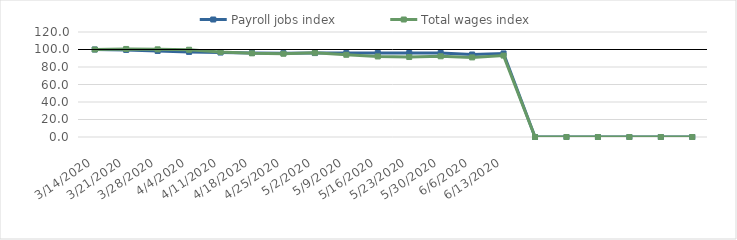
| Category | Payroll jobs index | Total wages index |
|---|---|---|
| 14/03/2020 | 100 | 100 |
| 21/03/2020 | 99.534 | 100.617 |
| 28/03/2020 | 98.354 | 100.187 |
| 04/04/2020 | 97.248 | 99.698 |
| 11/04/2020 | 96.526 | 97.144 |
| 18/04/2020 | 95.964 | 95.652 |
| 25/04/2020 | 95.822 | 95.162 |
| 02/05/2020 | 95.905 | 96.207 |
| 09/05/2020 | 95.893 | 93.951 |
| 16/05/2020 | 96.076 | 92.051 |
| 23/05/2020 | 95.981 | 91.406 |
| 30/05/2020 | 96.031 | 92.235 |
| 06/06/2020 | 94.278 | 90.974 |
| 13/06/2020 | 95.493 | 93.046 |